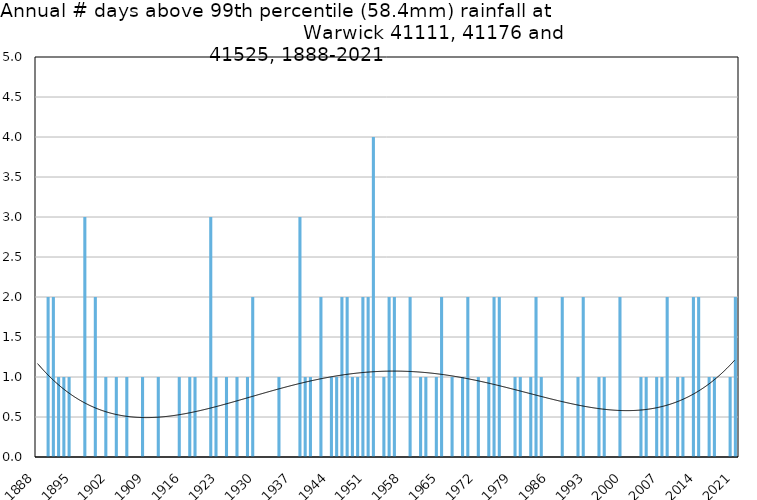
| Category | Annual # days above 99th percentile |
|---|---|
| 1888 | 0 |
| 1889 | 0 |
| 1890 | 2 |
| 1891 | 2 |
| 1892 | 1 |
| 1893 | 1 |
| 1894 | 1 |
| 1895 | 0 |
| 1896 | 0 |
| 1897 | 3 |
| 1898 | 0 |
| 1899 | 2 |
| 1900 | 0 |
| 1901 | 1 |
| 1902 | 0 |
| 1903 | 1 |
| 1904 | 0 |
| 1905 | 1 |
| 1906 | 0 |
| 1907 | 0 |
| 1908 | 1 |
| 1909 | 0 |
| 1910 | 0 |
| 1911 | 1 |
| 1912 | 0 |
| 1913 | 0 |
| 1914 | 0 |
| 1915 | 1 |
| 1916 | 0 |
| 1917 | 1 |
| 1918 | 1 |
| 1919 | 0 |
| 1920 | 0 |
| 1921 | 3 |
| 1922 | 1 |
| 1923 | 0 |
| 1924 | 1 |
| 1925 | 0 |
| 1926 | 1 |
| 1927 | 0 |
| 1928 | 1 |
| 1929 | 2 |
| 1930 | 0 |
| 1931 | 0 |
| 1932 | 0 |
| 1933 | 0 |
| 1934 | 1 |
| 1935 | 0 |
| 1936 | 0 |
| 1937 | 0 |
| 1938 | 3 |
| 1939 | 1 |
| 1940 | 1 |
| 1941 | 0 |
| 1942 | 2 |
| 1943 | 0 |
| 1944 | 1 |
| 1945 | 1 |
| 1946 | 2 |
| 1947 | 2 |
| 1948 | 1 |
| 1949 | 1 |
| 1950 | 2 |
| 1951 | 2 |
| 1952 | 4 |
| 1953 | 0 |
| 1954 | 1 |
| 1955 | 2 |
| 1956 | 2 |
| 1957 | 0 |
| 1958 | 0 |
| 1959 | 2 |
| 1960 | 0 |
| 1961 | 1 |
| 1962 | 1 |
| 1963 | 0 |
| 1964 | 1 |
| 1965 | 2 |
| 1966 | 0 |
| 1967 | 1 |
| 1968 | 0 |
| 1969 | 1 |
| 1970 | 2 |
| 1971 | 0 |
| 1972 | 1 |
| 1973 | 0 |
| 1974 | 1 |
| 1975 | 2 |
| 1976 | 2 |
| 1977 | 0 |
| 1978 | 0 |
| 1979 | 1 |
| 1980 | 1 |
| 1981 | 0 |
| 1982 | 1 |
| 1983 | 2 |
| 1984 | 1 |
| 1985 | 0 |
| 1986 | 0 |
| 1987 | 0 |
| 1988 | 2 |
| 1989 | 0 |
| 1990 | 0 |
| 1991 | 1 |
| 1992 | 2 |
| 1993 | 0 |
| 1994 | 0 |
| 1995 | 1 |
| 1996 | 1 |
| 1997 | 0 |
| 1998 | 0 |
| 1999 | 2 |
| 2000 | 0 |
| 2001 | 0 |
| 2002 | 0 |
| 2003 | 1 |
| 2004 | 1 |
| 2005 | 0 |
| 2006 | 1 |
| 2007 | 1 |
| 2008 | 2 |
| 2009 | 0 |
| 2010 | 1 |
| 2011 | 1 |
| 2012 | 0 |
| 2013 | 2 |
| 2014 | 2 |
| 2015 | 0 |
| 2016 | 1 |
| 2017 | 1 |
| 2018 | 0 |
| 2019 | 0 |
| 2020 | 1 |
| 2021 | 2 |